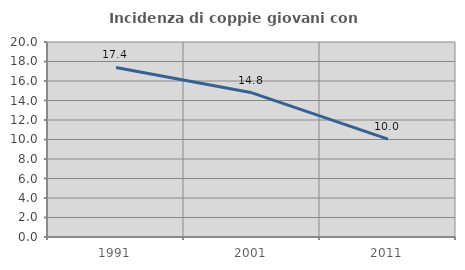
| Category | Incidenza di coppie giovani con figli |
|---|---|
| 1991.0 | 17.391 |
| 2001.0 | 14.788 |
| 2011.0 | 10.033 |